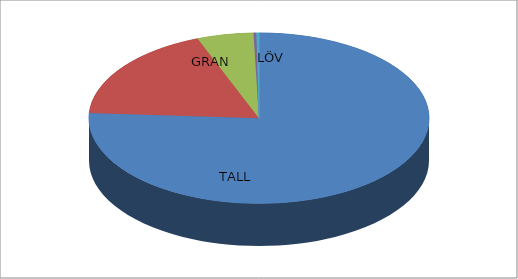
| Category | Series 0 |
|---|---|
| 0 | 1248462 |
| 1 | 298723 |
| 2 | 88089 |
| 3 | 4376 |
| 4 | 4094 |